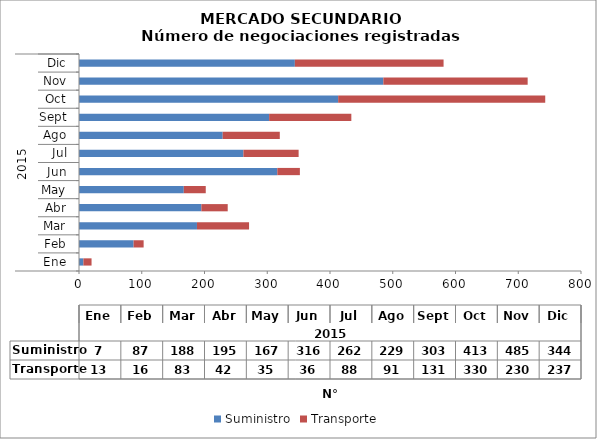
| Category | Suministro | Transporte |
|---|---|---|
| 0 | 7 | 13 |
| 1 | 87 | 16 |
| 2 | 188 | 83 |
| 3 | 195 | 42 |
| 4 | 167 | 35 |
| 5 | 316 | 36 |
| 6 | 262 | 88 |
| 7 | 229 | 91 |
| 8 | 303 | 131 |
| 9 | 413 | 330 |
| 10 | 485 | 230 |
| 11 | 344 | 237 |